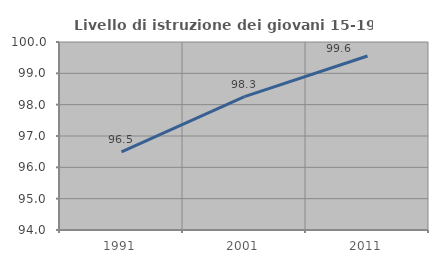
| Category | Livello di istruzione dei giovani 15-19 anni |
|---|---|
| 1991.0 | 96.49 |
| 2001.0 | 98.258 |
| 2011.0 | 99.554 |